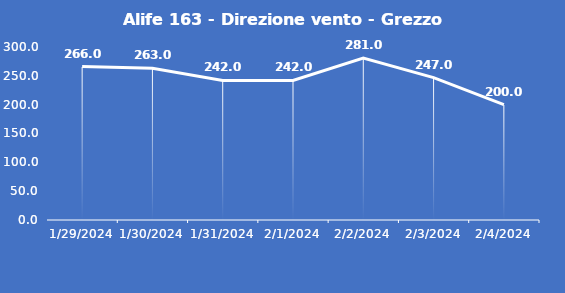
| Category | Alife 163 - Direzione vento - Grezzo (°N) |
|---|---|
| 1/29/24 | 266 |
| 1/30/24 | 263 |
| 1/31/24 | 242 |
| 2/1/24 | 242 |
| 2/2/24 | 281 |
| 2/3/24 | 247 |
| 2/4/24 | 200 |